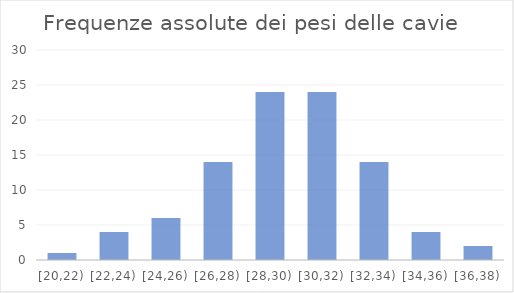
| Category | Frequenze assolute |
|---|---|
| [20,22) | 1 |
| [22,24) | 4 |
| [24,26) | 6 |
| [26,28) | 14 |
| [28,30) | 24 |
| [30,32) | 24 |
| [32,34) | 14 |
| [34,36) | 4 |
| [36,38) | 2 |